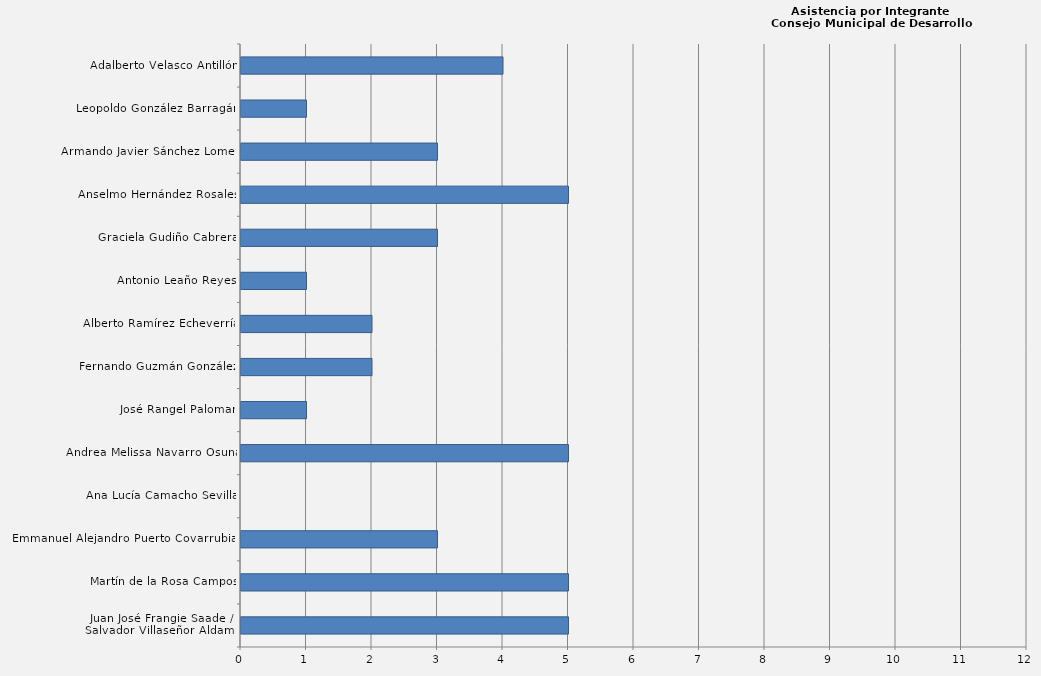
| Category | Series 0 |
|---|---|
| Juan José Frangie Saade /
Salvador Villaseñor Aldama | 5 |
| Martín de la Rosa Campos | 5 |
| Emmanuel Alejandro Puerto Covarrubias | 3 |
| Ana Lucía Camacho Sevilla | 0 |
| Andrea Melissa Navarro Osuna | 5 |
| José Rangel Palomar | 1 |
| Fernando Guzmán González | 2 |
| Alberto Ramírez Echeverría | 2 |
| Antonio Leaño Reyes | 1 |
| Graciela Gudiño Cabrera | 3 |
| Anselmo Hernández Rosales | 5 |
| Armando Javier Sánchez Lomelí | 3 |
| Leopoldo González Barragán | 1 |
| Adalberto Velasco Antillón | 4 |